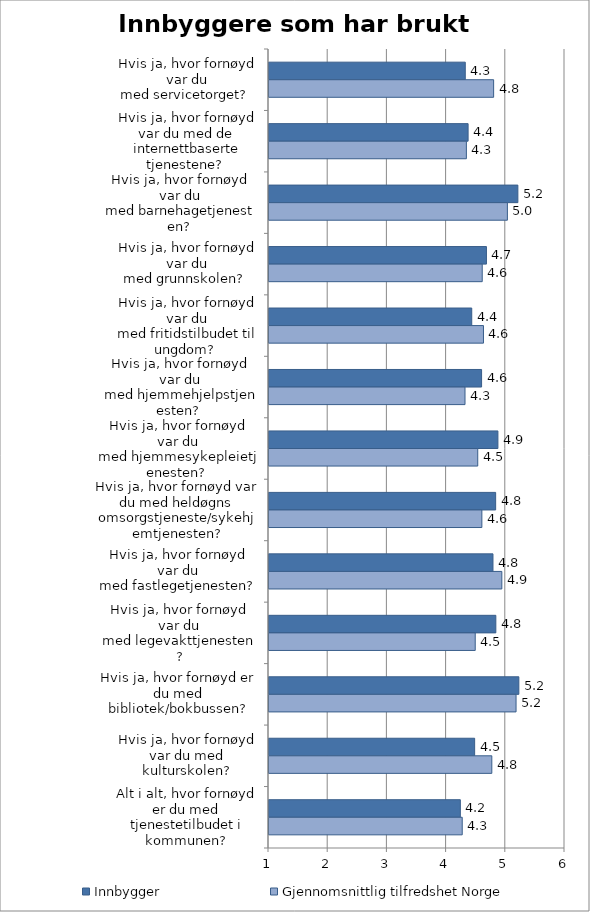
| Category | Innbygger | Gjennomsnittlig tilfredshet Norge |
|---|---|---|
| Hvis ja, hvor fornøyd var du med servicetorget?  | 4.315 | 4.794 |
| Hvis ja, hvor fornøyd var du med de internettbaserte tjenestene?  | 4.363 | 4.334 |
| Hvis ja, hvor fornøyd var du med barnehagetjenesten?  | 5.204 | 5.027 |
| Hvis ja, hvor fornøyd var du med grunnskolen?  | 4.673 | 4.602 |
| Hvis ja, hvor fornøyd var du med fritidstilbudet til ungdom?  | 4.425 | 4.623 |
| Hvis ja, hvor fornøyd var du med hjemmehjelpstjenesten?  | 4.591 | 4.311 |
| Hvis ja, hvor fornøyd var du med hjemmesykepleietjenesten?  | 4.867 | 4.526 |
| Hvis ja, hvor fornøyd var du med heldøgns omsorgstjeneste/sykehjemtjenesten? | 4.829 | 4.596 |
| Hvis ja, hvor fornøyd var du med fastlegetjenesten? | 4.783 | 4.933 |
| Hvis ja, hvor fornøyd var du med legevakttjenesten? | 4.832 | 4.483 |
| Hvis ja, hvor fornøyd er du med bibliotek/bokbussen? | 5.221 | 5.173 |
| Hvis ja, hvor fornøyd var du med kulturskolen? | 4.474 | 4.764 |
| Alt i alt, hvor fornøyd er du med tjenestetilbudet i kommunen? | 4.232 | 4.264 |